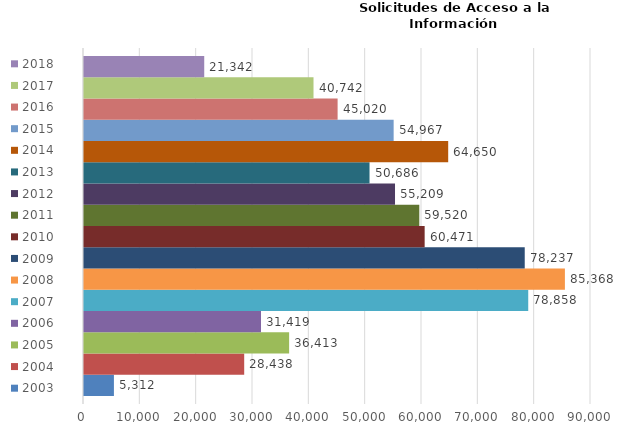
| Category | 2003 | 2004 | 2005 | 2006 | 2007 | 2008 | 2009 | 2010 | 2011 | 2012 | 2013 | 2014 | 2015 | 2016 | 2017 | 2018 |
|---|---|---|---|---|---|---|---|---|---|---|---|---|---|---|---|---|
| 0 | 5312 | 28438 | 36413 | 31419 | 78858 | 85368 | 78237 | 60471 | 59520 | 55209 | 50686 | 64650 | 54967 | 45020 | 40742 | 21342 |